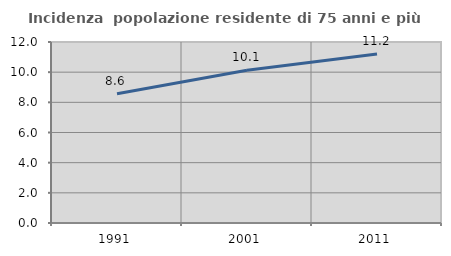
| Category | Incidenza  popolazione residente di 75 anni e più |
|---|---|
| 1991.0 | 8.57 |
| 2001.0 | 10.131 |
| 2011.0 | 11.206 |